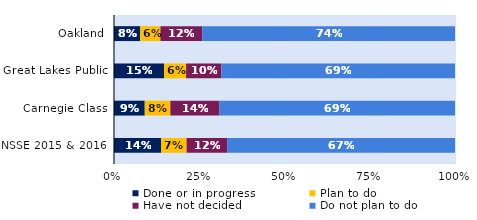
| Category | Done or in progress | Plan to do | Have not decided | Do not plan to do |
|---|---|---|---|---|
| Oakland | 0.077 | 0.059 | 0.123 | 0.741 |
| Great Lakes Public | 0.147 | 0.065 | 0.103 | 0.685 |
| Carnegie Class | 0.09 | 0.075 | 0.144 | 0.691 |
| NSSE 2015 & 2016 | 0.138 | 0.075 | 0.119 | 0.668 |